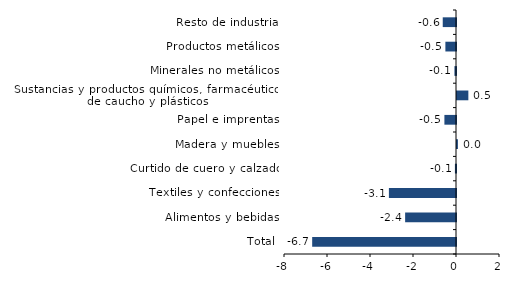
| Category | Series 0 |
|---|---|
| Total | -6.689 |
| Alimentos y bebidas | -2.366 |
| Textiles y confecciones | -3.121 |
| Curtido de cuero y calzado | -0.051 |
| Madera y muebles | 0.043 |
| Papel e imprentas | -0.54 |
| Sustancias y productos químicos, farmacéuticos, de caucho y plásticos | 0.528 |
| Minerales no metálicos | -0.073 |
| Productos metálicos | -0.494 |
| Resto de industria | -0.617 |